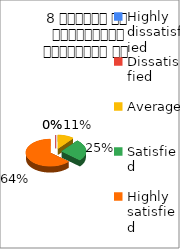
| Category | 8 शिक्षक का सम्प्रेषण सुस्पष्ठ है  |
|---|---|
| Highly dissatisfied | 0 |
| Dissatisfied | 0 |
| Average | 6 |
| Satisfied | 14 |
| Highly satisfied | 35 |